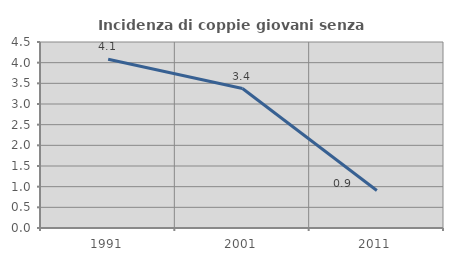
| Category | Incidenza di coppie giovani senza figli |
|---|---|
| 1991.0 | 4.082 |
| 2001.0 | 3.374 |
| 2011.0 | 0.906 |